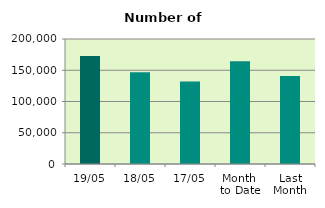
| Category | Series 0 |
|---|---|
| 19/05 | 172816 |
| 18/05 | 146796 |
| 17/05 | 131806 |
| Month 
to Date | 164201 |
| Last
Month | 140978.316 |